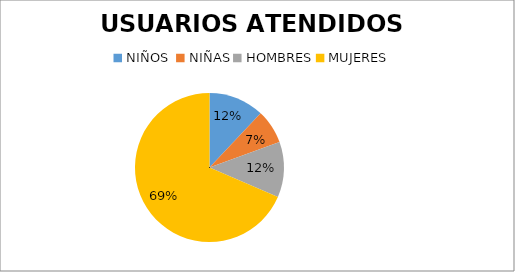
| Category | USUARIOS ATENDIDOS  PORCENTAJE | USUARIOS ATENDIDOS  CANTIDAD |
|---|---|---|
| NIÑOS  | 12.037 | 26 |
| NIÑAS | 7.407 | 16 |
| HOMBRES | 12.037 | 26 |
| MUJERES | 68.519 | 148 |